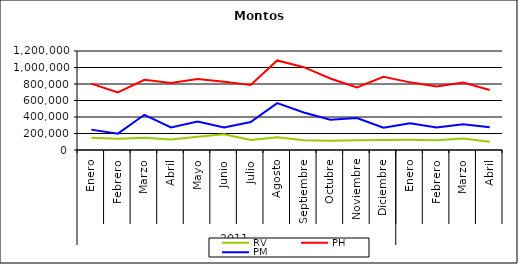
| Category | RV | PH | PM |
|---|---|---|---|
| 0 | 148144.221 | 804017.034 | 246879.816 |
| 1 | 135442.022 | 698080.315 | 197816.384 |
| 2 | 148709.608 | 851539.16 | 426858.277 |
| 3 | 127054.101 | 811120.717 | 274472.233 |
| 4 | 161428.333 | 861109.431 | 346137.903 |
| 5 | 192094.935 | 828642.879 | 272798.51 |
| 6 | 120456.289 | 788790.249 | 339543.2 |
| 7 | 155602.256 | 1085460.536 | 567694.929 |
| 8 | 117324.254 | 1003661.474 | 453740.608 |
| 9 | 110706.658 | 866712.028 | 366251.288 |
| 10 | 117203.695 | 757508.742 | 387517.995 |
| 11 | 121034.981 | 888386.375 | 269833.466 |
| 12 | 123119.659 | 819877.166 | 324690.254 |
| 13 | 119357.51 | 768583.334 | 272644.496 |
| 14 | 138093.991 | 817068.707 | 312641.558 |
| 15 | 100821.144 | 726813.436 | 276815.26 |